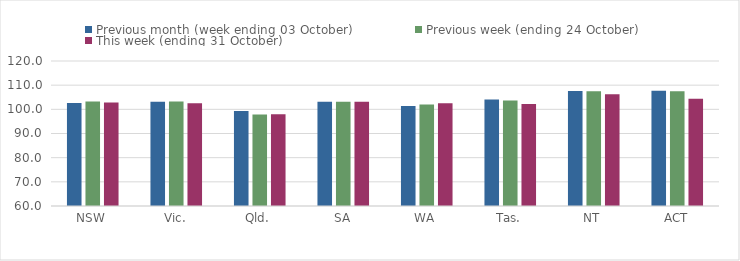
| Category | Previous month (week ending 03 October) | Previous week (ending 24 October) | This week (ending 31 October) |
|---|---|---|---|
| NSW | 102.62 | 103.27 | 102.84 |
| Vic. | 103.13 | 103.22 | 102.52 |
| Qld. | 99.3 | 97.91 | 98 |
| SA | 103.18 | 103.18 | 103.18 |
| WA | 101.42 | 102.05 | 102.52 |
| Tas. | 104.09 | 103.68 | 102.16 |
| NT | 107.62 | 107.53 | 106.29 |
| ACT | 107.66 | 107.53 | 104.4 |